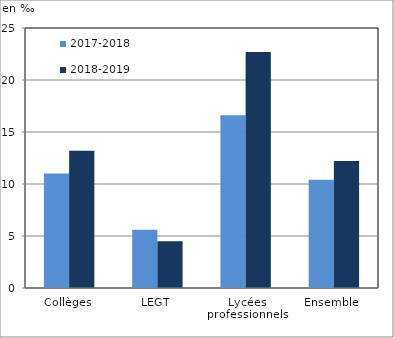
| Category | 2017-2018 | 2018-2019 |
|---|---|---|
| Collèges | 11 | 13.2 |
| LEGT | 5.6 | 4.5 |
| Lycées professionnels | 16.6 | 22.7 |
| Ensemble  | 10.4 | 12.2 |